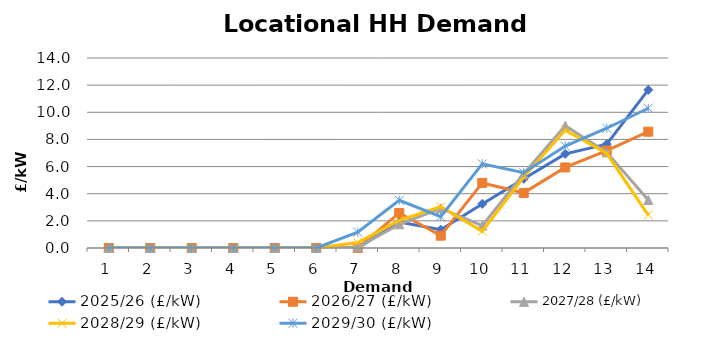
| Category | 2025/26 (£/kW) | 2026/27 (£/kW) | 2027/28 (£/kW) | 2028/29 (£/kW) | 2029/30 (£/kW) |
|---|---|---|---|---|---|
| 1.0 | 0 | 0 | 0 | 0 | 0 |
| 2.0 | 0 | 0 | 0 | 0 | 0 |
| 3.0 | 0 | 0 | 0 | 0 | 0 |
| 4.0 | 0 | 0 | 0 | 0 | 0 |
| 5.0 | 0 | 0 | 0 | 0 | 0 |
| 6.0 | 0 | 0 | 0 | 0 | 0 |
| 7.0 | 0 | 0 | 0.068 | 0.407 | 1.168 |
| 8.0 | 1.906 | 2.584 | 1.745 | 2.026 | 3.517 |
| 9.0 | 1.351 | 0.908 | 2.925 | 3.044 | 2.308 |
| 10.0 | 3.248 | 4.795 | 1.65 | 1.235 | 6.2 |
| 11.0 | 5.098 | 4.061 | 5.473 | 5.224 | 5.544 |
| 12.0 | 6.937 | 5.936 | 9.012 | 8.688 | 7.516 |
| 13.0 | 7.651 | 7.181 | 7.048 | 6.967 | 8.824 |
| 14.0 | 11.647 | 8.57 | 3.534 | 2.427 | 10.299 |